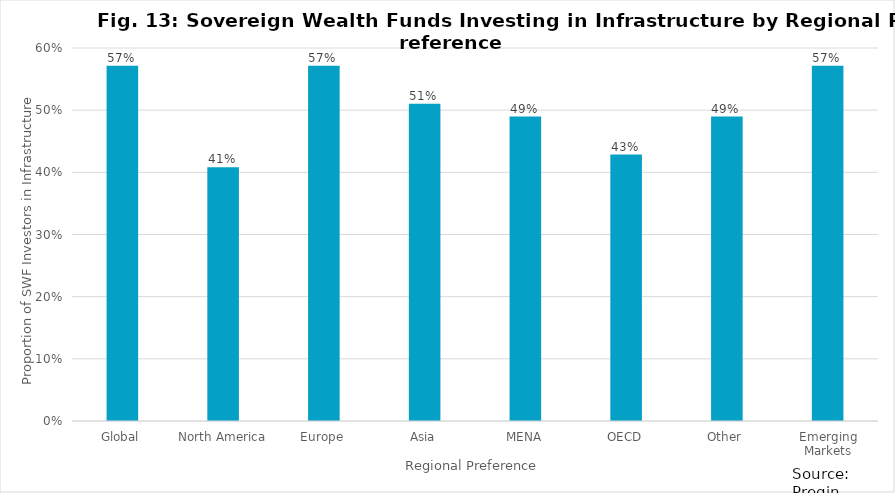
| Category | Series 0 |
|---|---|
| Global | 0.571 |
| North America | 0.408 |
| Europe | 0.571 |
| Asia | 0.51 |
| MENA | 0.49 |
| OECD | 0.429 |
| Other | 0.49 |
| Emerging Markets | 0.571 |